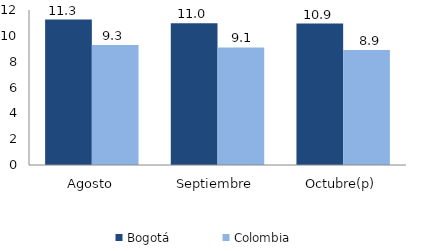
| Category | Bogotá | Colombia |
|---|---|---|
| Agosto | 11.257 | 9.294 |
| Septiembre | 10.969 | 9.098 |
| Octubre(p) | 10.946 | 8.9 |